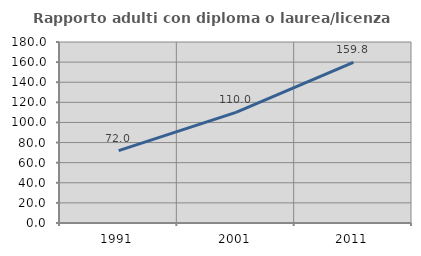
| Category | Rapporto adulti con diploma o laurea/licenza media  |
|---|---|
| 1991.0 | 72.023 |
| 2001.0 | 109.96 |
| 2011.0 | 159.837 |